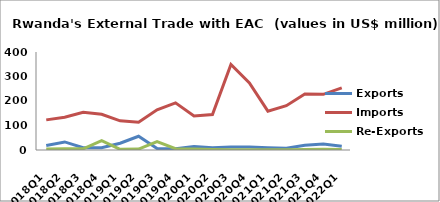
| Category | Exports | Imports | Re-Exports |
|---|---|---|---|
| 2018Q1 | 18.608 | 122.951 | 4.57 |
| 2018Q2 | 32.909 | 133.823 | 4.622 |
| 2018Q3 | 9.064 | 153.831 | 4.747 |
| 2018Q4 | 8.931 | 145.657 | 38.097 |
| 2019Q1 | 27.532 | 118.895 | 2.571 |
| 2019Q2 | 55.968 | 113.561 | 3.654 |
| 2019Q3 | 6.192 | 164.3 | 34.329 |
| 2019Q4 | 5.149 | 192.569 | 5.268 |
| 2020Q1 | 14.209 | 138.663 | 3.748 |
| 2020Q2 | 8.786 | 144.885 | 1.712 |
| 2020Q3 | 11.767 | 348.723 | 1.141 |
| 2020Q4 | 12.136 | 273.335 | 0.92 |
| 2021Q1 | 9.302 | 158.626 | 0.693 |
| 2021Q2 | 7.396 | 180.858 | 1.076 |
| 2021Q3 | 19.208 | 228.408 | 2.214 |
| 2021Q4 | 24.275 | 227.083 | 3.044 |
| 2022Q1 | 14.976 | 253.288 | 1.717 |